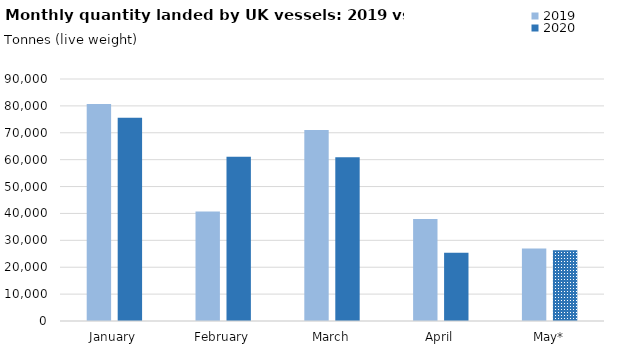
| Category | 2019 | 2020 |
|---|---|---|
| January | 80737.638 | 75576 |
| February | 40696.55 | 61042 |
| March | 71050.699 | 60890 |
| April | 37938.786 | 25380 |
| May* | 27003.791 | 26276.323 |